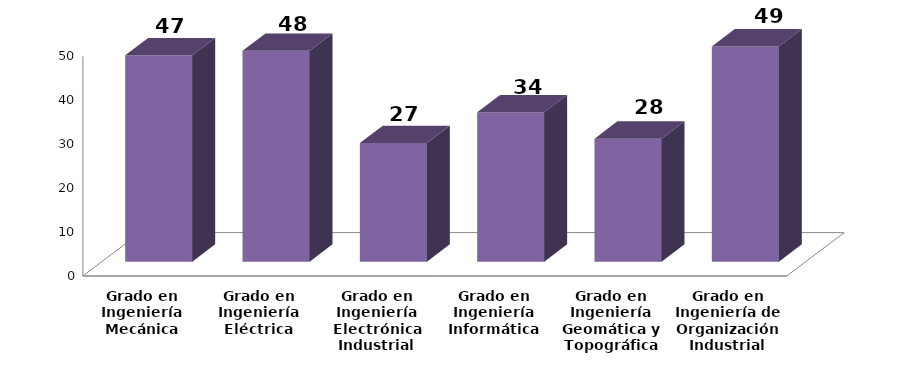
| Category | Series 0 |
|---|---|
| Grado en Ingeniería Mecánica | 47 |
| Grado en Ingeniería Eléctrica | 48 |
| Grado en Ingeniería Electrónica Industrial | 27 |
| Grado en Ingeniería Informática | 34 |
| Grado en Ingeniería Geomática y Topográfica | 28 |
| Grado en Ingeniería de Organización Industrial | 49 |